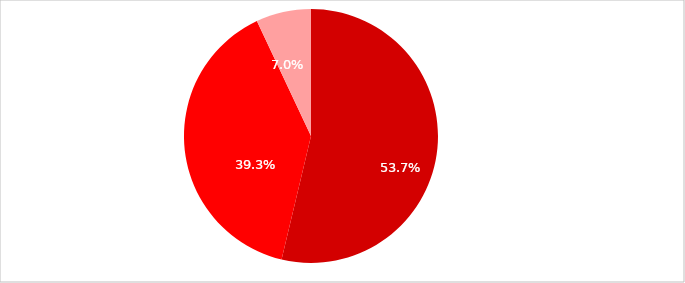
| Category | Series 1 |
|---|---|
| 63.07 | 0.537 |
| 34.69 | 0.393 |
| 13.5 | 0.07 |